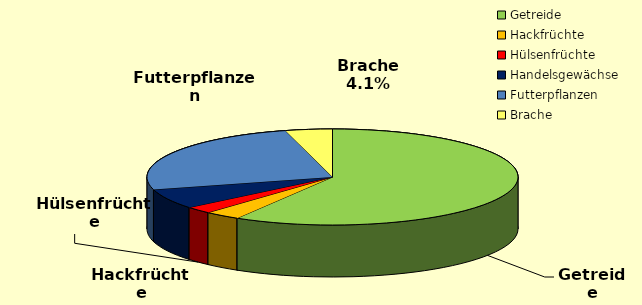
| Category | Series 0 |
|---|---|
| Getreide | 463.5 |
| Hackfrüchte | 24.6 |
| Hülsenfrüchte | 18.6 |
| Handelsgewächse | 53.2 |
| Futterpflanzen | 198.7 |
| Brache | 32.4 |